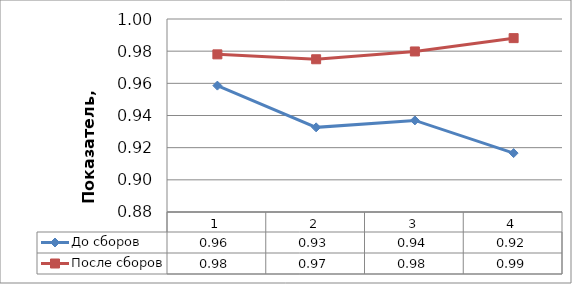
| Category | До сборов | После сборов |
|---|---|---|
| 0 | 0.959 | 0.978 |
| 1 | 0.933 | 0.975 |
| 2 | 0.937 | 0.98 |
| 3 | 0.917 | 0.988 |